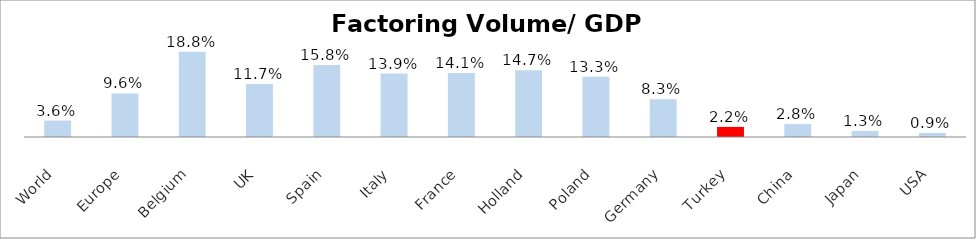
| Category | Factoring Volume/ GDP (%) |
|---|---|
| World | 0.036 |
| Europe | 0.096 |
| Belgium | 0.188 |
| UK | 0.117 |
| Spain | 0.158 |
| Italy | 0.139 |
| France | 0.141 |
| Holland | 0.147 |
| Poland | 0.133 |
| Germany | 0.083 |
| Turkey | 0.022 |
| China | 0.028 |
| Japan | 0.013 |
| USA | 0.009 |